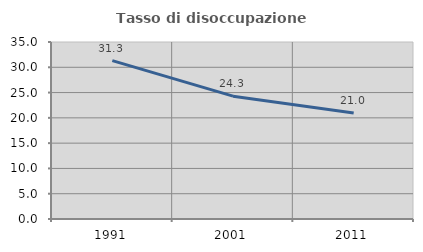
| Category | Tasso di disoccupazione giovanile  |
|---|---|
| 1991.0 | 31.313 |
| 2001.0 | 24.286 |
| 2011.0 | 20.968 |